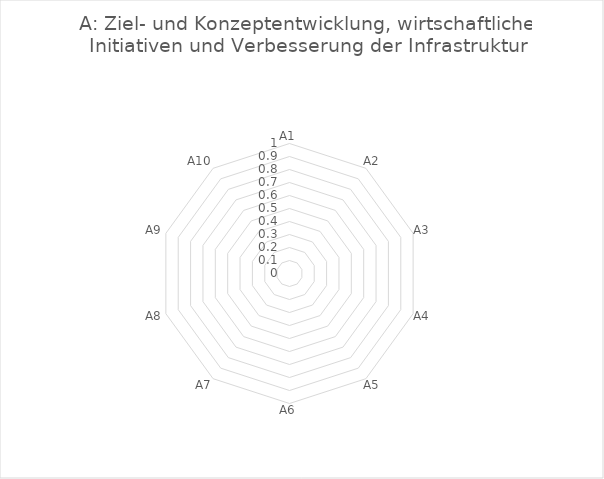
| Category | Series 0 |
|---|---|
| A1 | 0 |
| A2 | 0 |
| A3 | 0 |
| A4 | 0 |
| A5 | 0 |
| A6 | 0 |
| A7 | 0 |
| A8 | 0 |
| A9 | 0 |
| A10 | 0 |